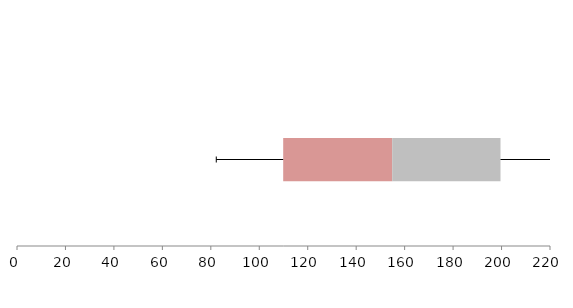
| Category | Series 1 | Series 2 | Series 3 |
|---|---|---|---|
| 0 | 109.875 | 44.997 | 44.695 |